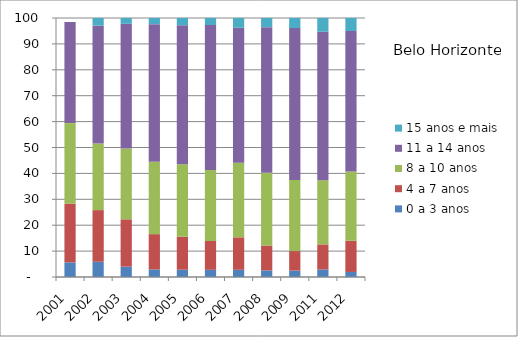
| Category | 0 a 3 anos | 4 a 7 anos | 8 a 10 anos | 11 a 14 anos | 15 anos e mais |
|---|---|---|---|---|---|
| 2001.0 | 5.66 | 22.68 | 31.08 | 38.99 | 0 |
| 2002.0 | 5.88 | 19.95 | 25.71 | 45.49 | 2.97 |
| 2003.0 | 4 | 18.27 | 27.34 | 48.12 | 2.27 |
| 2004.0 | 2.91 | 13.64 | 27.91 | 53.15 | 2.39 |
| 2005.0 | 2.82 | 12.72 | 28.01 | 53.64 | 2.82 |
| 2006.0 | 2.77 | 11.15 | 27.35 | 56.02 | 2.71 |
| 2007.0 | 2.79 | 12.52 | 28.81 | 52.11 | 3.76 |
| 2008.0 | 2.54 | 9.57 | 28.12 | 56.23 | 3.55 |
| 2009.0 | 2.47 | 7.55 | 27.46 | 58.62 | 3.9 |
| 2011.0 | 2.89 | 9.7 | 24.78 | 57.31 | 5.32 |
| 2012.0 | 1.95 | 12.04 | 26.74 | 54.26 | 5.01 |